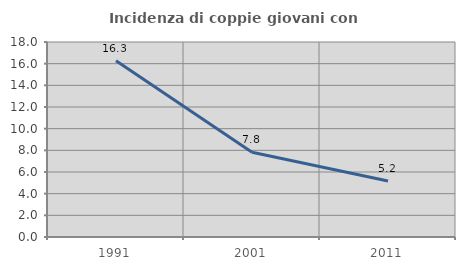
| Category | Incidenza di coppie giovani con figli |
|---|---|
| 1991.0 | 16.275 |
| 2001.0 | 7.827 |
| 2011.0 | 5.174 |